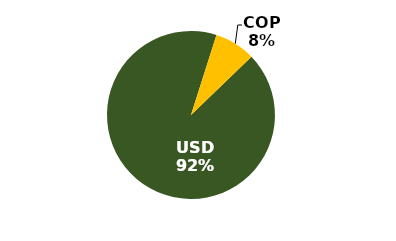
| Category | Series 0 |
|---|---|
| USD | 0.921 |
| COP | 0.079 |